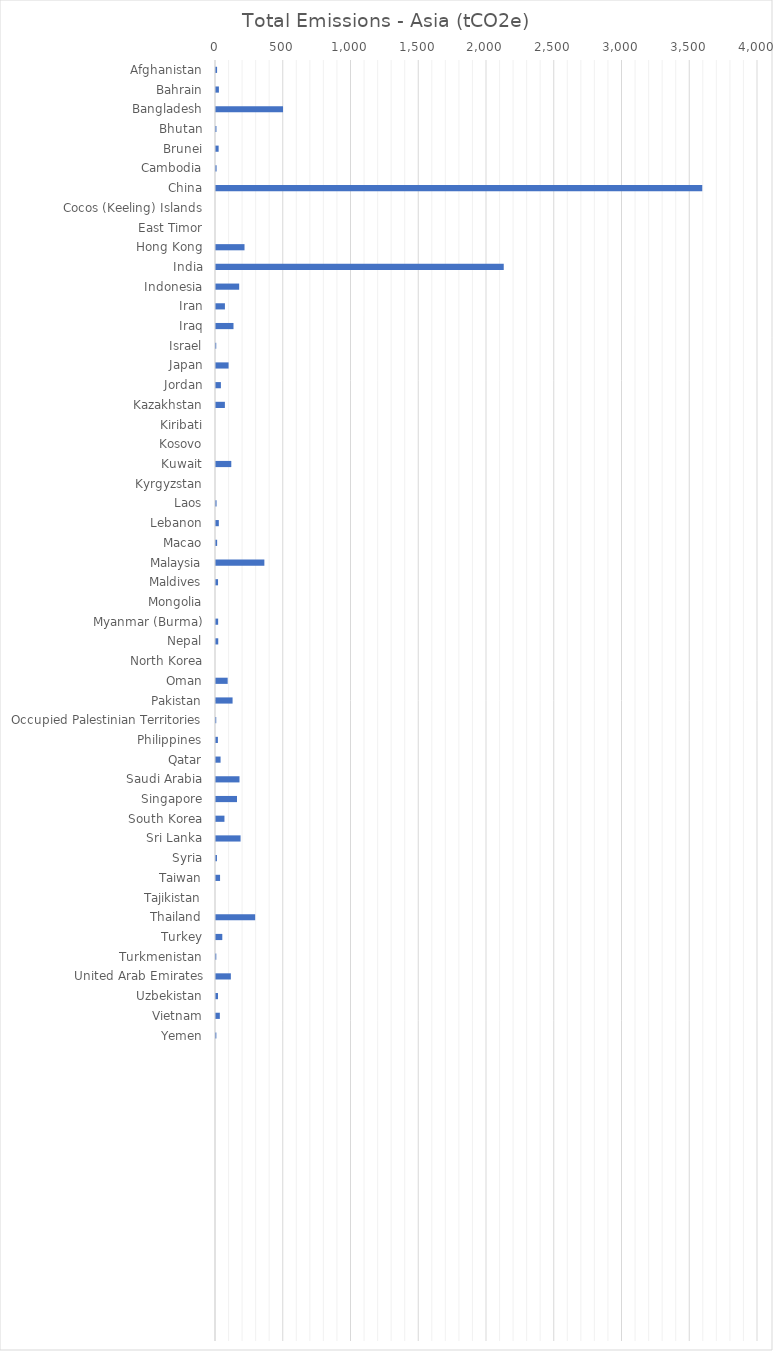
| Category | Total Emissions - Asia (tCO2e) |
|---|---|
| Afghanistan | 7.939 |
| Bahrain | 21.464 |
| Bangladesh | 494.663 |
| Bhutan | 3.412 |
| Brunei | 19.454 |
| Cambodia | 4.362 |
| China | 3588.686 |
| Cocos (Keeling) Islands | 0 |
| East Timor | 0 |
| Hong Kong | 210.438 |
| India | 2123.582 |
| Indonesia | 171.054 |
| Iran | 65.875 |
| Iraq | 129.15 |
| Israel | 1.8 |
| Japan | 92.817 |
| Jordan | 36.245 |
| Kazakhstan | 65.598 |
| Kiribati | 0 |
| Kosovo | 0 |
| Kuwait | 112.86 |
| Kyrgyzstan | 0 |
| Laos | 4.106 |
| Lebanon | 20.864 |
| Macao | 8.394 |
| Malaysia | 356.937 |
| Maldives | 15.055 |
| Mongolia | 0 |
| Myanmar (Burma) | 15.874 |
| Nepal | 16.53 |
| North Korea | 0 |
| Oman | 86.16 |
| Pakistan | 122.362 |
| Occupied Palestinian Territories | 1.8 |
| Philippines | 14.021 |
| Qatar | 33.784 |
| Saudi Arabia | 173.361 |
| Singapore | 155.153 |
| South Korea | 62.41 |
| Sri Lanka | 181.343 |
| Syria | 7.085 |
| Taiwan | 29.953 |
| Tajikistan | 0 |
| Thailand | 289.037 |
| Turkey | 46.434 |
| Turkmenistan | 2.259 |
| United Arab Emirates | 109.652 |
| Uzbekistan | 14.731 |
| Vietnam | 28.358 |
| Yemen | 2.593 |